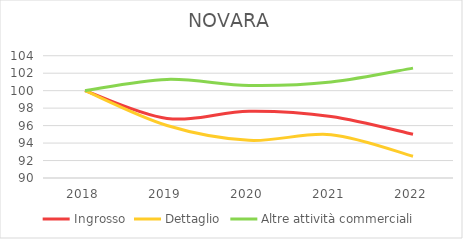
| Category | Ingrosso | Dettaglio | Altre attività commerciali |
|---|---|---|---|
| 2018.0 | 100 | 100 | 100 |
| 2019.0 | 96.823 | 96.009 | 101.29 |
| 2020.0 | 97.644 | 94.31 | 100.595 |
| 2021.0 | 97.037 | 94.959 | 100.992 |
| 2022.0 | 95.002 | 92.496 | 102.579 |